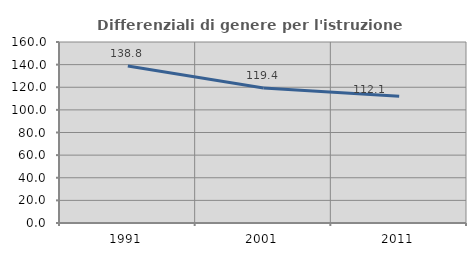
| Category | Differenziali di genere per l'istruzione superiore |
|---|---|
| 1991.0 | 138.778 |
| 2001.0 | 119.421 |
| 2011.0 | 112.098 |